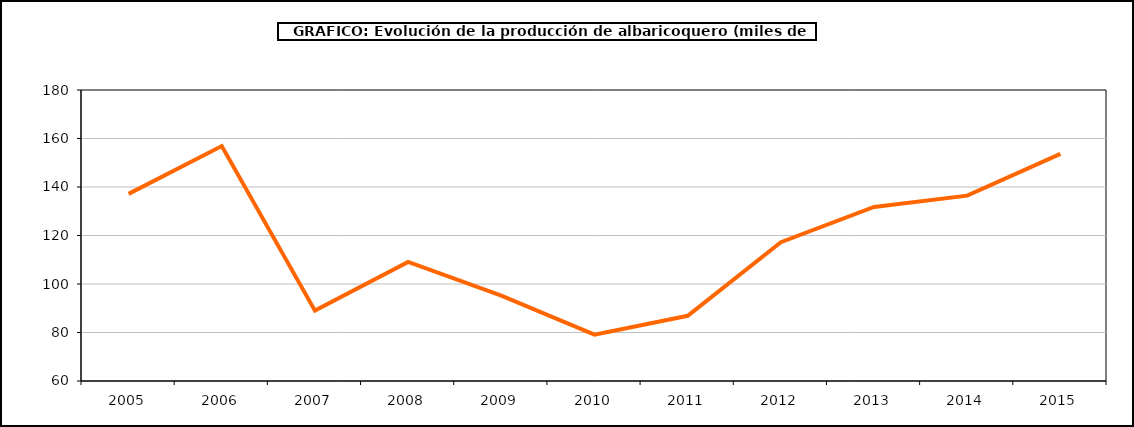
| Category | producción albaricoquero |
|---|---|
| 2005.0 | 137.167 |
| 2006.0 | 156.872 |
| 2007.0 | 89.023 |
| 2008.0 | 109.108 |
| 2009.0 | 95.221 |
| 2010.0 | 79.101 |
| 2011.0 | 86.88 |
| 2012.0 | 117.24 |
| 2013.0 | 131.776 |
| 2014.0 | 136.446 |
| 2015.0 | 153.667 |